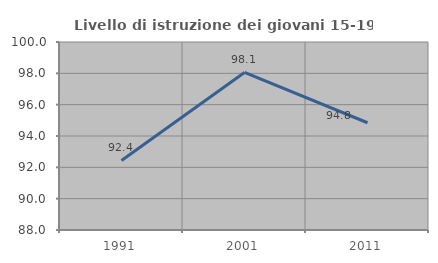
| Category | Livello di istruzione dei giovani 15-19 anni |
|---|---|
| 1991.0 | 92.442 |
| 2001.0 | 98.058 |
| 2011.0 | 94.845 |